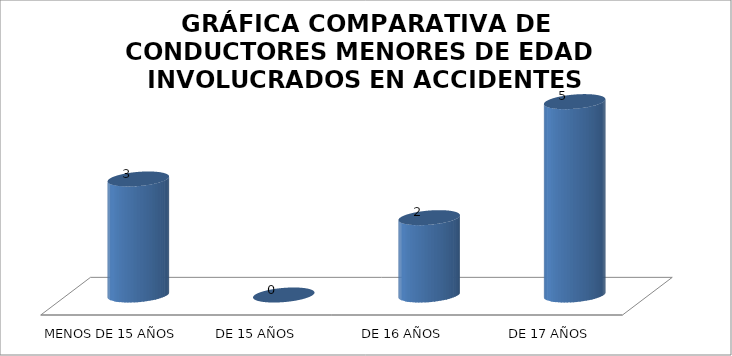
| Category | Series 0 |
|---|---|
| MENOS DE 15 AÑOS | 3 |
| DE 15 AÑOS | 0 |
| DE 16 AÑOS | 2 |
|  DE 17 AÑOS | 5 |